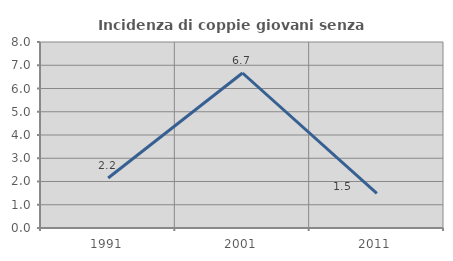
| Category | Incidenza di coppie giovani senza figli |
|---|---|
| 1991.0 | 2.151 |
| 2001.0 | 6.667 |
| 2011.0 | 1.493 |